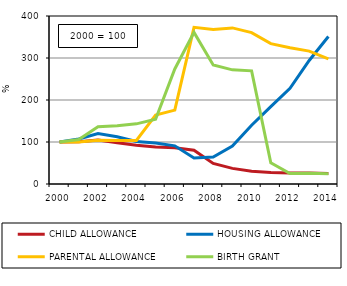
| Category | CHILD ALLOWANCE | HOUSING ALLOWANCE | PARENTAL ALLOWANCE | BIRTH GRANT |
|---|---|---|---|---|
| 2000.0 | 100 | 100 | 100 | 100 |
| 2001.0 | 100.4 | 107.149 | 100.13 | 106.024 |
| 2002.0 | 104.746 | 120.254 | 104.304 | 136.145 |
| 2003.0 | 98.204 | 112.589 | 103.55 | 138.898 |
| 2004.0 | 92.485 | 101.191 | 103.55 | 143.201 |
| 2005.0 | 87.818 | 97.617 | 164.179 | 154.045 |
| 2006.0 | 86.547 | 90.826 | 175.868 | 273.838 |
| 2007.0 | 80.295 | 62.153 | 373.033 | 360.929 |
| 2008.0 | 48.886 | 64.297 | 367.885 | 283.477 |
| 2009.0 | 37.151 | 90.548 | 371.681 | 271.773 |
| 2010.0 | 30.295 | 139.833 | 360.447 | 269.363 |
| 2011.0 | 27.44 | 184.313 | 334.274 | 50.258 |
| 2012.0 | 26.137 | 227.641 | 324.405 | 24.785 |
| 2013.0 | 26.114 | 294.003 | 316.422 | 25.473 |
| 2014.0 | 25.157 | 351.191 | 297.92 | 24.613 |